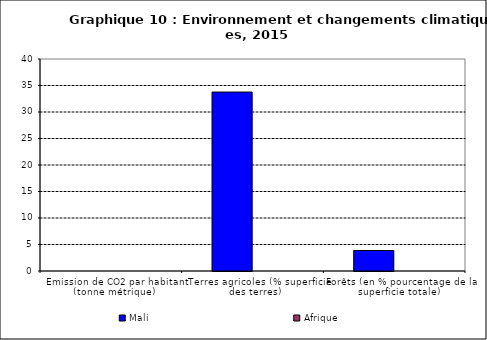
| Category | Mali | Afrique |
|---|---|---|
| Emission de CO2 par habitant (tonne métrique) | 0 | 0 |
| Terres agricoles (% superficie des terres) | 33.766 | 0 |
| Forêts (en % pourcentage de la superficie totale) | 3.864 | 0 |